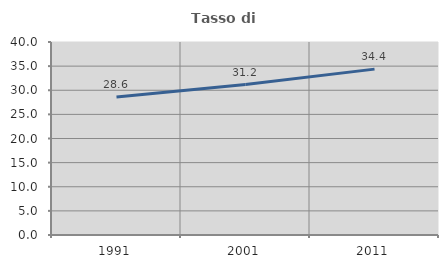
| Category | Tasso di occupazione   |
|---|---|
| 1991.0 | 28.605 |
| 2001.0 | 31.184 |
| 2011.0 | 34.379 |